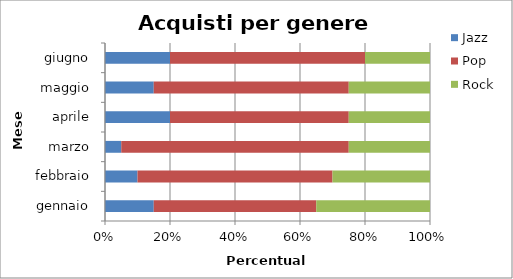
| Category | Jazz | Pop | Rock |
|---|---|---|---|
| gennaio | 15 | 50 | 35 |
| febbraio | 10 | 60 | 30 |
| marzo | 5 | 70 | 25 |
| aprile | 20 | 55 | 25 |
| maggio | 15 | 60 | 25 |
| giugno | 20 | 60 | 20 |